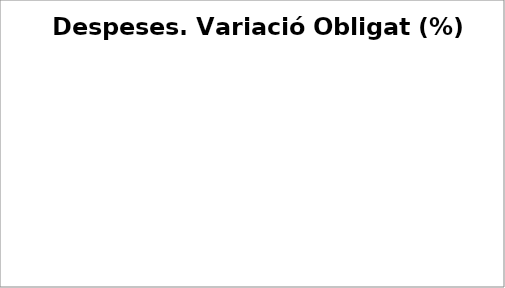
| Category | Series 0 |
|---|---|
| Despeses de personal | 0.027 |
| Despeses en béns corrents i serveis | -0.023 |
| Despeses financeres | -0.474 |
| Transferències corrents | 0.112 |
| Fons de contingència | 0 |
| Inversions reals | -0.167 |
| Transferències de capital | 2.275 |
| Actius financers | 0.099 |
| Passius financers | 0.001 |